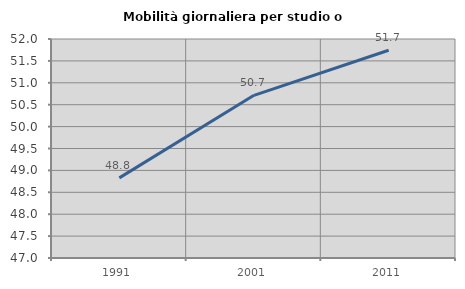
| Category | Mobilità giornaliera per studio o lavoro |
|---|---|
| 1991.0 | 48.83 |
| 2001.0 | 50.714 |
| 2011.0 | 51.742 |